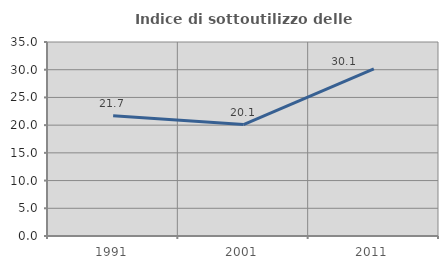
| Category | Indice di sottoutilizzo delle abitazioni  |
|---|---|
| 1991.0 | 21.675 |
| 2001.0 | 20.103 |
| 2011.0 | 30.144 |